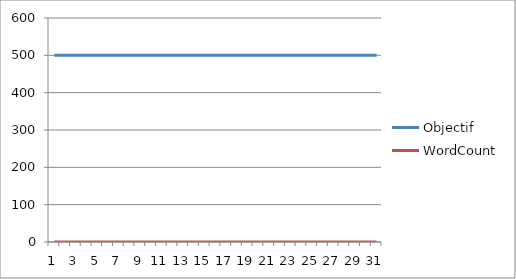
| Category | Objectif | WordCount |
|---|---|---|
| 0 | 500 | 0 |
| 1 | 500 | 0 |
| 2 | 500 | 0 |
| 3 | 500 | 0 |
| 4 | 500 | 0 |
| 5 | 500 | 0 |
| 6 | 500 | 0 |
| 7 | 500 | 0 |
| 8 | 500 | 0 |
| 9 | 500 | 0 |
| 10 | 500 | 0 |
| 11 | 500 | 0 |
| 12 | 500 | 0 |
| 13 | 500 | 0 |
| 14 | 500 | 0 |
| 15 | 500 | 0 |
| 16 | 500 | 0 |
| 17 | 500 | 0 |
| 18 | 500 | 0 |
| 19 | 500 | 0 |
| 20 | 500 | 0 |
| 21 | 500 | 0 |
| 22 | 500 | 0 |
| 23 | 500 | 0 |
| 24 | 500 | 0 |
| 25 | 500 | 0 |
| 26 | 500 | 0 |
| 27 | 500 | 0 |
| 28 | 500 | 0 |
| 29 | 500 | 0 |
| 30 | 500 | 0 |